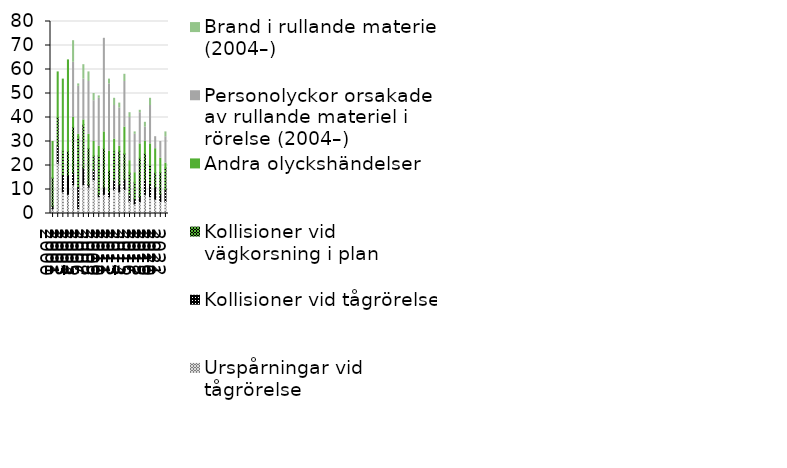
| Category | Urspårningar vid tågrörelse  | Kollisioner vid tågrörelse  | Kollisioner vid vägkorsning i plan | Andra olyckshändelser | Personolyckor orsakade av rullande materiel i rörelse (2004–) | Brand i rullande materiel (2004–) |
|---|---|---|---|---|---|---|
| 2000 | 2 | 1 | 12 | 15 | 0 | 0 |
| 2001 | 21 | 7 | 12 | 19 | 0 | 0 |
| 2002 | 9 | 7 | 10 | 30 | 0 | 0 |
| 2003 | 8 | 8 | 10 | 38 | 0 | 0 |
| 2004 | 12 | 5 | 19 | 4 | 23 | 9 |
| 2005 | 2 | 9 | 21 | 1 | 20 | 1 |
| 2006 | 12 | 7 | 18 | 2 | 17 | 6 |
| 2007 | 11 | 1 | 15 | 6 | 22 | 4 |
| 2008 | 14 | 4 | 6 | 6 | 17 | 3 |
| 2009 | 7 | 1 | 16 | 4 | 20 | 1 |
| 2010 | 8 | 3 | 16 | 7 | 39 | 0 |
| 2011 | 7 | 2 | 9 | 8 | 28 | 2 |
| 2012 | 10 | 4 | 12 | 5 | 14 | 3 |
| 2013 | 9 | 3 | 14 | 2 | 16 | 2 |
| 2014 | 10 | 4 | 11 | 11 | 19 | 3 |
| 2015 | 5 | 3 | 9 | 5 | 18 | 2 |
| 2016 | 4 | 2 | 7 | 4 | 16 | 1 |
| 2017 | 5 | 2 | 16 | 6 | 13 | 1 |
| 2018 | 8 | 6 | 11 | 5 | 6 | 2 |
| 2019 | 7 | 5 | 8 | 9 | 16 | 3 |
| 2020 | 6 | 5 | 6 | 10 | 5 | 0 |
| 2021 | 5 | 3 | 9 | 6 | 7 | 0 |
| 2022 | 5 | 5 | 9 | 2 | 11 | 2 |